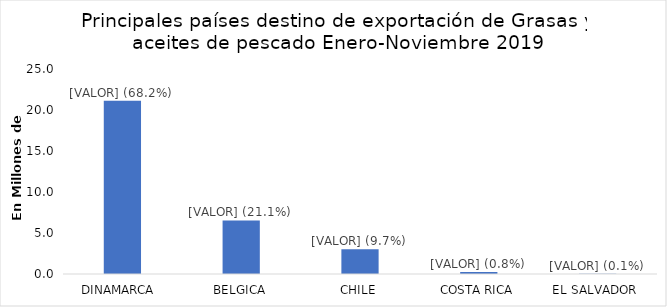
| Category | Series 0 |
|---|---|
| DINAMARCA  | 21127670 |
| BELGICA | 6538400 |
| CHILE | 3016230 |
| COSTA RICA | 258244 |
| EL SALVADOR  | 25931 |